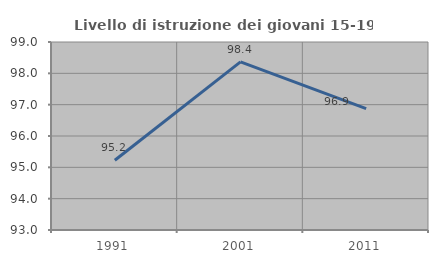
| Category | Livello di istruzione dei giovani 15-19 anni |
|---|---|
| 1991.0 | 95.226 |
| 2001.0 | 98.367 |
| 2011.0 | 96.875 |